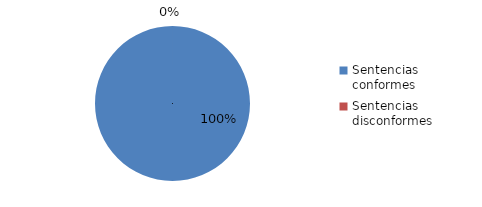
| Category | Series 0 |
|---|---|
| Sentencias conformes | 6 |
| Sentencias disconformes | 0 |